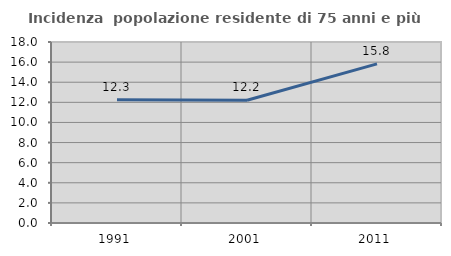
| Category | Incidenza  popolazione residente di 75 anni e più |
|---|---|
| 1991.0 | 12.251 |
| 2001.0 | 12.212 |
| 2011.0 | 15.829 |